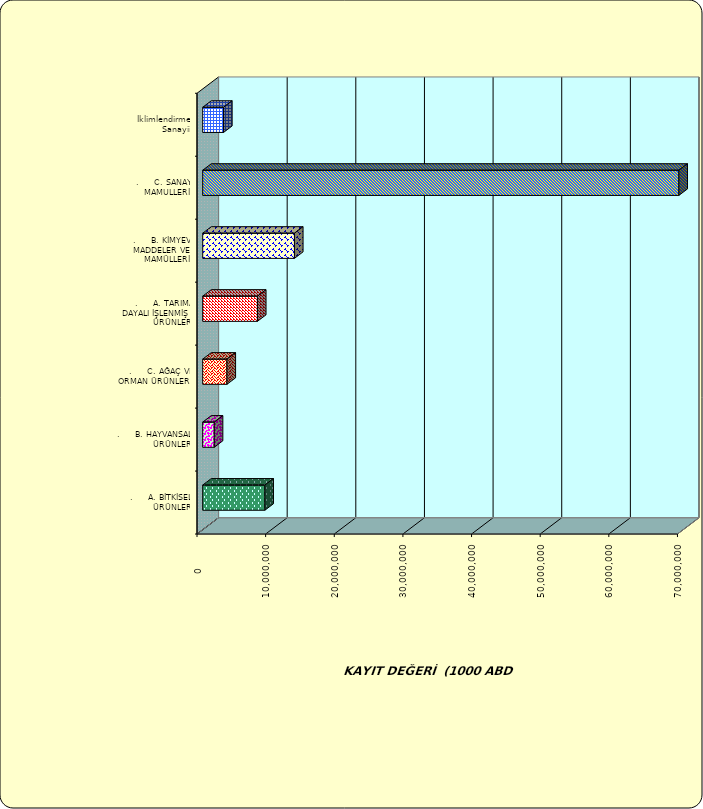
| Category | Series 0 |
|---|---|
| .     A. BİTKİSEL ÜRÜNLER | 9058548.52 |
| .     B. HAYVANSAL ÜRÜNLER | 1682294.77 |
| .     C. AĞAÇ VE ORMAN ÜRÜNLERİ | 3538290.614 |
| .     A. TARIMA DAYALI İŞLENMİŞ ÜRÜNLER | 7973454.971 |
| .     B. KİMYEVİ MADDELER VE MAMÜLLERİ | 13370081.219 |
| .     C. SANAYİ MAMULLERİ | 69376773.777 |
|  İklimlendirme Sanayii | 3036337.078 |